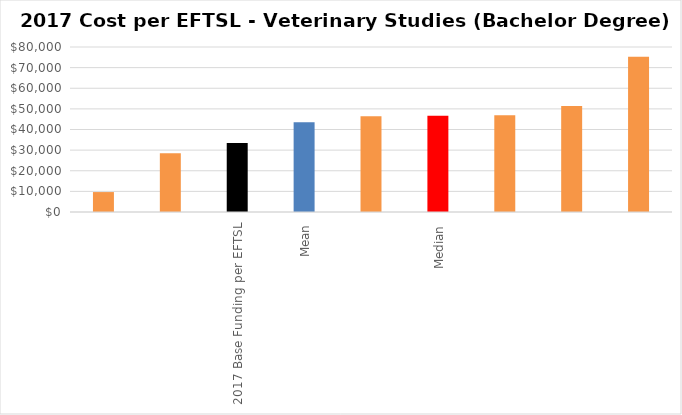
| Category | Series 0 |
|---|---|
|  | 9661.848 |
|  | 28502.763 |
| 2017 Base Funding per EFTSL | 33405 |
| Mean | 43547 |
|  | 46468.366 |
| Median | 46681.335 |